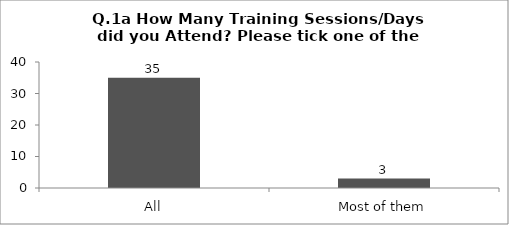
| Category | Q.1a How Many Training Sessions/Days did you Attend? Please tick one of the answers below |
|---|---|
| All | 35 |
| Most of them | 3 |